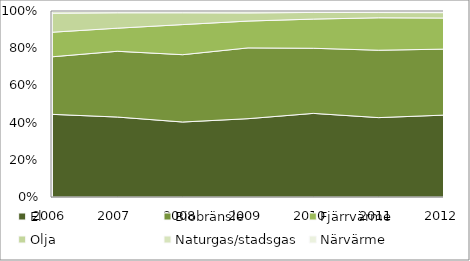
| Category | El | Biobränsle | Fjärrvärme | Olja | Naturgas/stadsgas | Närvärme |
|---|---|---|---|---|---|---|
| 2006.0 | 0.447 | 0.311 | 0.133 | 0.103 | 0.009 | 0.003 |
| 2007.0 | 0.43 | 0.354 | 0.124 | 0.083 | 0.006 | 0.003 |
| 2008.0 | 0.403 | 0.362 | 0.162 | 0.063 | 0.006 | 0.003 |
| 2009.0 | 0.421 | 0.381 | 0.144 | 0.044 | 0.006 | 0.004 |
| 2010.0 | 0.45 | 0.35 | 0.157 | 0.036 | 0.006 | 0.002 |
| 2011.0 | 0.427 | 0.362 | 0.174 | 0.028 | 0.004 | 0.005 |
| 2012.0 | 0.44 | 0.355 | 0.167 | 0.029 | 0.005 | 0.004 |